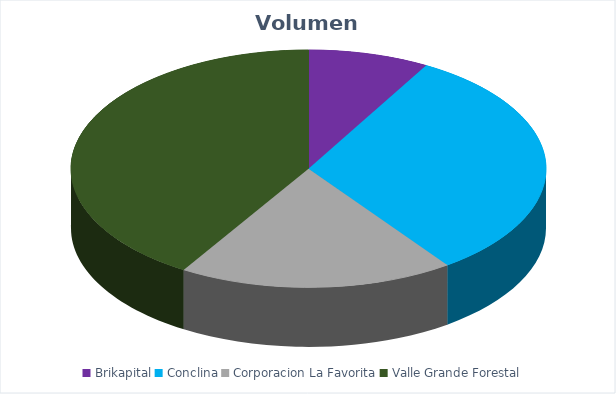
| Category | VOLUMEN ($USD) |
|---|---|
| Brikapital | 1000 |
| Conclina | 3864.96 |
| Corporacion La Favorita | 2272.32 |
| Valle Grande Forestal | 5002.4 |